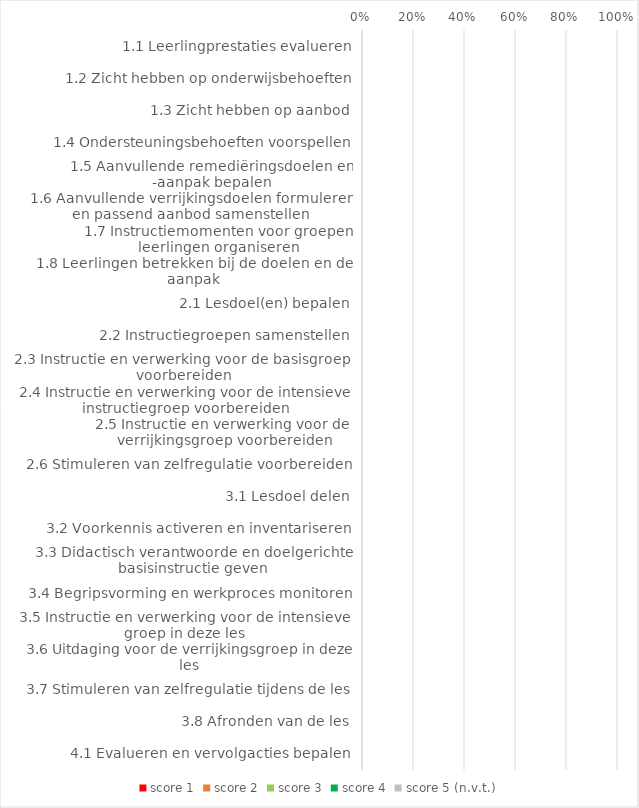
| Category | score 1 | score 2 | score 3 | score 4 | score 5 (n.v.t.) |
|---|---|---|---|---|---|
| 1.1 Leerlingprestaties evalueren | 0 | 0 | 0 | 0 | 0 |
| 1.2 Zicht hebben op onderwijsbehoeften | 0 | 0 | 0 | 0 | 0 |
| 1.3 Zicht hebben op aanbod | 0 | 0 | 0 | 0 | 0 |
| 1.4 Ondersteuningsbehoeften voorspellen | 0 | 0 | 0 | 0 | 0 |
| 1.5 Aanvullende remediëringsdoelen en -aanpak bepalen | 0 | 0 | 0 | 0 | 0 |
| 1.6 Aanvullende verrijkingsdoelen formuleren en passend aanbod samenstellen | 0 | 0 | 0 | 0 | 0 |
| 1.7 Instructiemomenten voor groepen leerlingen organiseren | 0 | 0 | 0 | 0 | 0 |
| 1.8 Leerlingen betrekken bij de doelen en de aanpak | 0 | 0 | 0 | 0 | 0 |
| 2.1 Lesdoel(en) bepalen | 0 | 0 | 0 | 0 | 0 |
| 2.2 Instructiegroepen samenstellen | 0 | 0 | 0 | 0 | 0 |
| 2.3 Instructie en verwerking voor de basisgroep voorbereiden | 0 | 0 | 0 | 0 | 0 |
| 2.4 Instructie en verwerking voor de intensieve instructiegroep voorbereiden | 0 | 0 | 0 | 0 | 0 |
| 2.5 Instructie en verwerking voor de verrijkingsgroep voorbereiden | 0 | 0 | 0 | 0 | 0 |
| 2.6 Stimuleren van zelfregulatie voorbereiden | 0 | 0 | 0 | 0 | 0 |
| 3.1 Lesdoel delen | 0 | 0 | 0 | 0 | 0 |
| 3.2 Voorkennis activeren en inventariseren | 0 | 0 | 0 | 0 | 0 |
| 3.3 Didactisch verantwoorde en doelgerichte basisinstructie geven | 0 | 0 | 0 | 0 | 0 |
| 3.4 Begripsvorming en werkproces monitoren | 0 | 0 | 0 | 0 | 0 |
| 3.5 Instructie en verwerking voor de intensieve groep in deze les | 0 | 0 | 0 | 0 | 0 |
| 3.6 Uitdaging voor de verrijkingsgroep in deze les | 0 | 0 | 0 | 0 | 0 |
| 3.7 Stimuleren van zelfregulatie tijdens de les | 0 | 0 | 0 | 0 | 0 |
| 3.8 Afronden van de les | 0 | 0 | 0 | 0 | 0 |
| 4.1 Evalueren en vervolgacties bepalen | 0 | 0 | 0 | 0 | 0 |